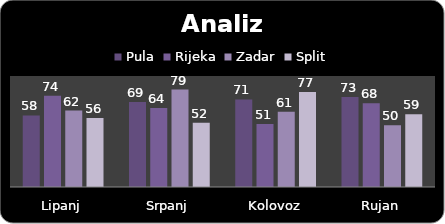
| Category | Pula | Rijeka | Zadar | Split |
|---|---|---|---|---|
| Lipanj | 58 | 74 | 62 | 56 |
| Srpanj | 69 | 64 | 79 | 52 |
| Kolovoz | 71 | 51 | 61 | 77 |
| Rujan | 73 | 68 | 50 | 59 |